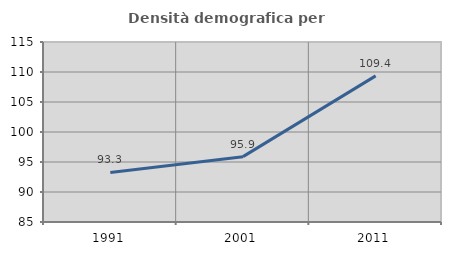
| Category | Densità demografica |
|---|---|
| 1991.0 | 93.265 |
| 2001.0 | 95.891 |
| 2011.0 | 109.359 |